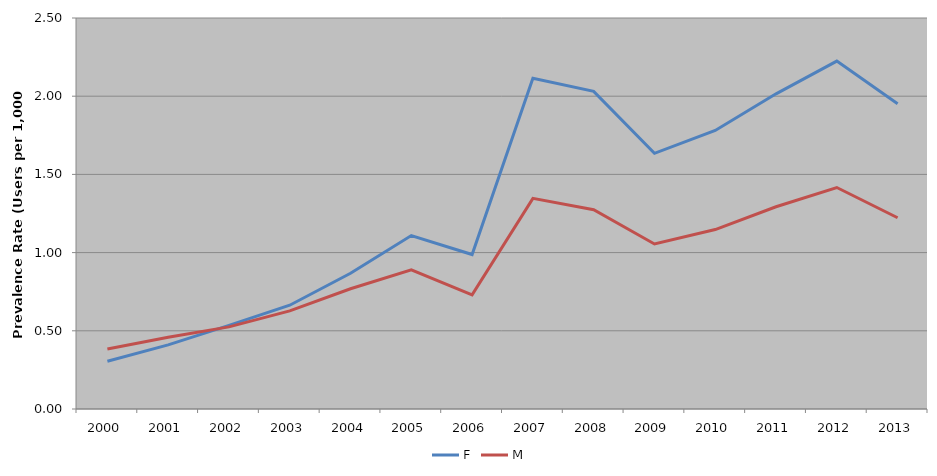
| Category | F | M |
|---|---|---|
| 2000 | 0.305 | 0.384 |
| 2001 | 0.41 | 0.459 |
| 2002 | 0.535 | 0.525 |
| 2003 | 0.663 | 0.628 |
| 2004 | 0.868 | 0.769 |
| 2005 | 1.109 | 0.89 |
| 2006 | 0.988 | 0.73 |
| 2007 | 2.115 | 1.347 |
| 2008 | 2.031 | 1.274 |
| 2009 | 1.635 | 1.055 |
| 2010 | 1.781 | 1.147 |
| 2011 | 2.015 | 1.293 |
| 2012 | 2.225 | 1.416 |
| 2013 | 1.952 | 1.223 |